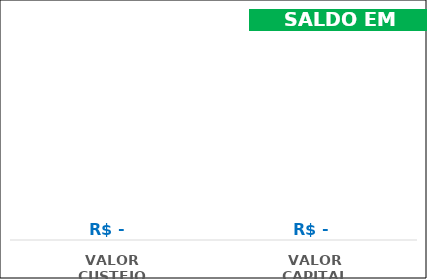
| Category | Series 0 |
|---|---|
| VALOR CUSTEIO | 0 |
| VALOR CAPITAL | 0 |